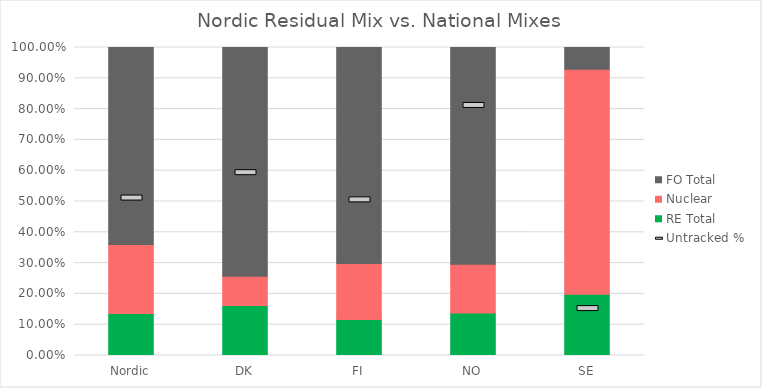
| Category | RE Total | Nuclear  | FO Total |
|---|---|---|---|
| Nordic | 0.137 | 0.224 | 0.639 |
| DK | 0.163 | 0.094 | 0.743 |
| FI | 0.117 | 0.182 | 0.701 |
| NO | 0.138 | 0.158 | 0.704 |
| SE | 0.199 | 0.73 | 0.071 |